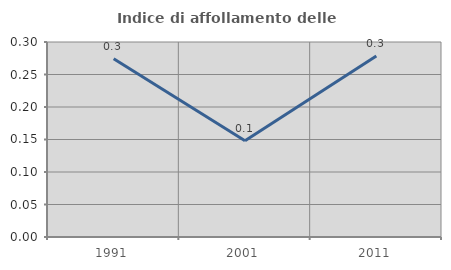
| Category | Indice di affollamento delle abitazioni  |
|---|---|
| 1991.0 | 0.274 |
| 2001.0 | 0.148 |
| 2011.0 | 0.278 |